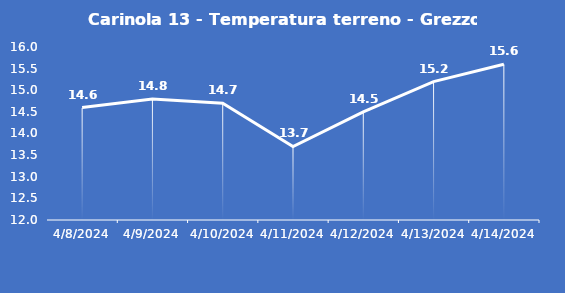
| Category | Carinola 13 - Temperatura terreno - Grezzo (°C) |
|---|---|
| 4/8/24 | 14.6 |
| 4/9/24 | 14.8 |
| 4/10/24 | 14.7 |
| 4/11/24 | 13.7 |
| 4/12/24 | 14.5 |
| 4/13/24 | 15.2 |
| 4/14/24 | 15.6 |